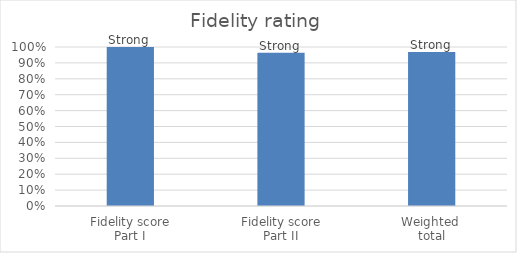
| Category | Series 0 |
|---|---|
| Fidelity score
Part I | 1 |
| Fidelity score
Part II | 0.964 |
| Weighted 
total | 0.969 |